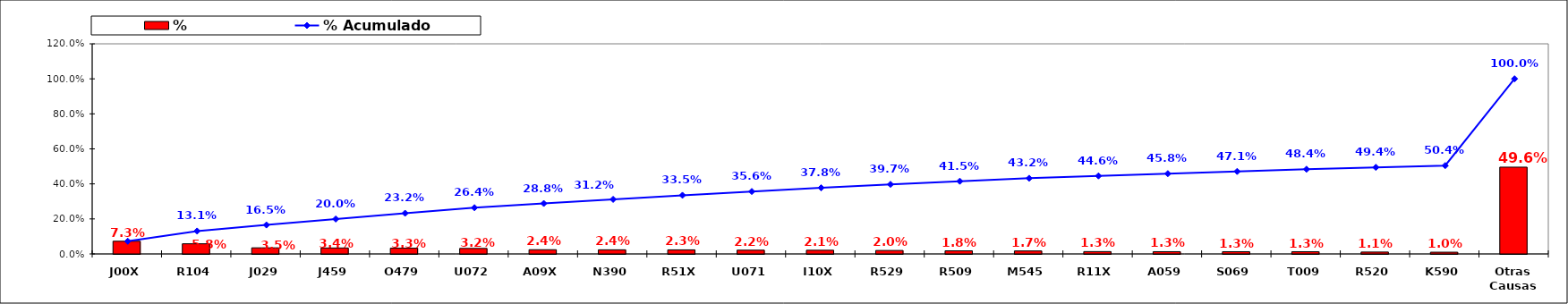
| Category | % |
|---|---|
| J00X | 0.073 |
| R104 | 0.058 |
| J029 | 0.035 |
| J459 | 0.034 |
| O479 | 0.033 |
| U072 | 0.032 |
| A09X | 0.024 |
| N390 | 0.024 |
| R51X | 0.023 |
| U071 | 0.022 |
| I10X | 0.021 |
| R529 | 0.02 |
| R509 | 0.018 |
| M545 | 0.017 |
| R11X | 0.013 |
| A059 | 0.013 |
| S069 | 0.013 |
| T009 | 0.013 |
| R520 | 0.011 |
| K590 | 0.01 |
| Otras Causas | 0.496 |